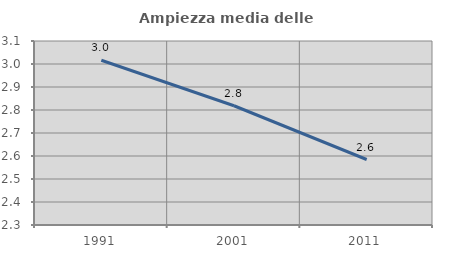
| Category | Ampiezza media delle famiglie |
|---|---|
| 1991.0 | 3.016 |
| 2001.0 | 2.818 |
| 2011.0 | 2.585 |